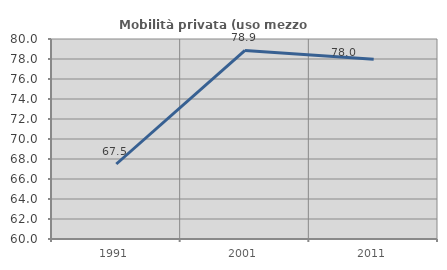
| Category | Mobilità privata (uso mezzo privato) |
|---|---|
| 1991.0 | 67.5 |
| 2001.0 | 78.859 |
| 2011.0 | 77.982 |